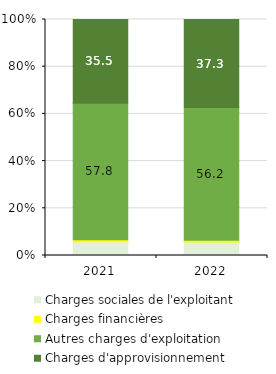
| Category | Charges sociales de l'exploitant | Charges financières | Autres charges d'exploitation | Charges d'approvisionnement |
|---|---|---|---|---|
| 2021.0 | 5.774 | 0.916 | 57.818 | 35.492 |
| 2022.0 | 5.682 | 0.788 | 56.233 | 37.298 |